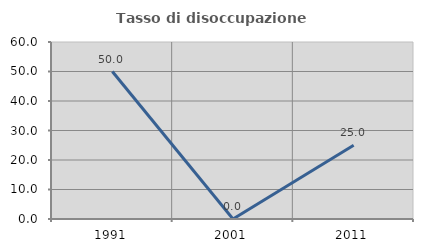
| Category | Tasso di disoccupazione giovanile  |
|---|---|
| 1991.0 | 50 |
| 2001.0 | 0 |
| 2011.0 | 25 |